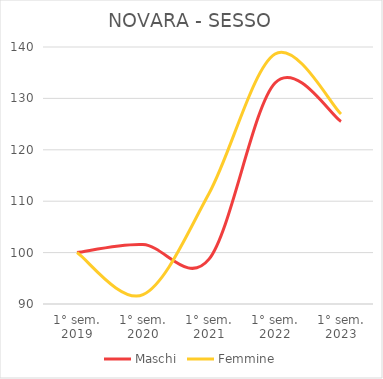
| Category | Maschi | Femmine |
|---|---|---|
| 1° sem.
2019 | 100 | 100 |
| 1° sem.
2020 | 101.559 | 91.812 |
| 1° sem.
2021 | 98.724 | 111.505 |
| 1° sem.
2022 | 133.003 | 138.636 |
| 1° sem.
2023 | 125.514 | 126.963 |